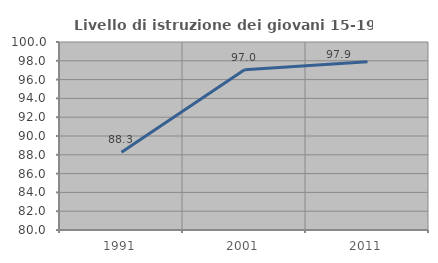
| Category | Livello di istruzione dei giovani 15-19 anni |
|---|---|
| 1991.0 | 88.259 |
| 2001.0 | 97.037 |
| 2011.0 | 97.887 |